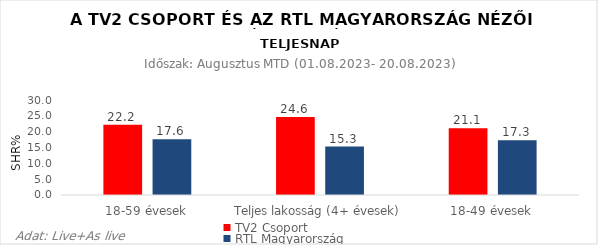
| Category | TV2 Csoport | RTL Magyarország |
|---|---|---|
| 18-59 évesek | 22.2 | 17.6 |
| Teljes lakosság (4+ évesek) | 24.6 | 15.3 |
| 18-49 évesek | 21.1 | 17.3 |